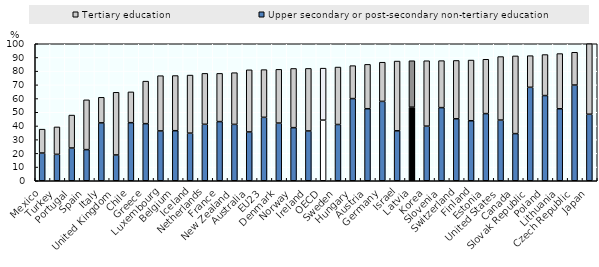
| Category | Upper secondary or post-secondary non-tertiary education | Tertiary education |
|---|---|---|
| Mexico | 20.243 | 17.419 |
| Turkey | 19.279 | 20.013 |
| Portugal | 23.914 | 24.023 |
| Spain | 22.723 | 36.351 |
| Italy | 42.246 | 18.67 |
| United Kingdom | 18.839 | 45.744 |
| Chile | 42.391 | 22.475 |
| Greece | 41.682 | 31.028 |
| Luxembourg | 36.372 | 40.326 |
| Belgium | 36.54 | 40.257 |
| Iceland | 34.753 | 42.384 |
| Netherlands | 41.214 | 37.168 |
| France | 43.171 | 35.214 |
| New Zealand | 41.151 | 37.73 |
| Australia | 35.632 | 45.356 |
| EU23 | 46.302 | 34.818 |
| Denmark | 42.097 | 39.232 |
| Norway | 38.762 | 43.207 |
| Ireland | 36.346 | 45.659 |
| OECD | 44.257 | 37.939 |
| Sweden | 41.06 | 41.937 |
| Hungary | 59.972 | 24.054 |
| Austria | 52.568 | 32.394 |
| Germany | 57.938 | 28.583 |
| Israel | 36.458 | 50.916 |
| Latvia | 53.726 | 33.882 |
| Korea | 39.867 | 47.745 |
| Slovenia | 53.38 | 34.3 |
| Switzerland | 45.214 | 42.595 |
| Finland | 43.8 | 44.304 |
| Estonia | 49.019 | 39.664 |
| United States | 44.289 | 46.357 |
| Canada | 34.413 | 56.715 |
| Slovak Republic | 68.206 | 23.095 |
| Poland | 62.192 | 29.919 |
| Lithuania | 52.554 | 40.274 |
| Czech Republic | 69.866 | 23.928 |
| Japan | 48.559 | 51.441 |